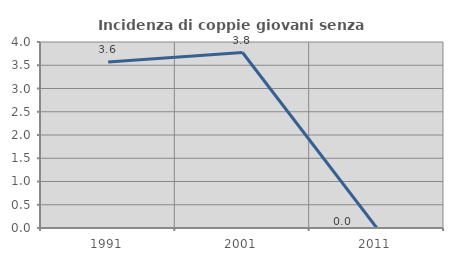
| Category | Incidenza di coppie giovani senza figli |
|---|---|
| 1991.0 | 3.571 |
| 2001.0 | 3.774 |
| 2011.0 | 0 |